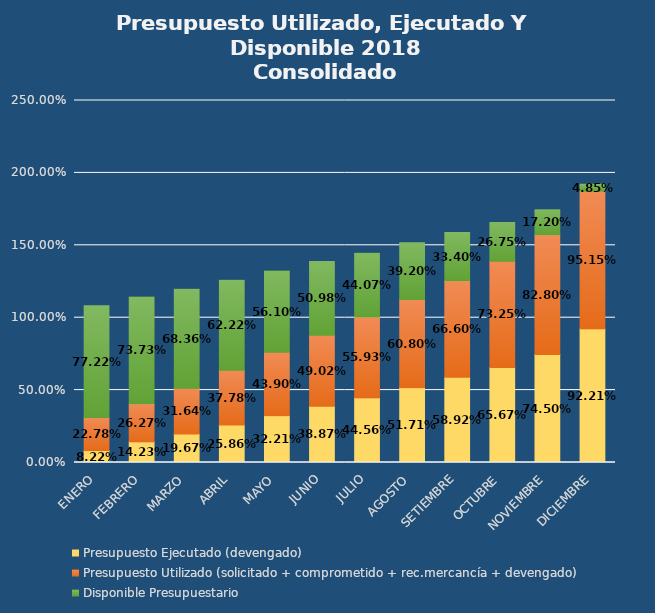
| Category | Presupuesto Ejecutado (devengado) | Presupuesto Utilizado (solicitado + comprometido + rec.mercancía + devengado) | Disponible Presupuestario |
|---|---|---|---|
| ENERO | 0.082 | 0.228 | 0.772 |
| FEBRERO | 0.142 | 0.263 | 0.737 |
| MARZO | 0.197 | 0.316 | 0.684 |
| ABRIL | 0.259 | 0.378 | 0.622 |
| MAYO | 0.322 | 0.439 | 0.561 |
| JUNIO | 0.389 | 0.49 | 0.51 |
| JULIO | 0.446 | 0.559 | 0.441 |
| AGOSTO | 0.517 | 0.608 | 0.392 |
| SETIEMBRE | 0.589 | 0.666 | 0.334 |
| OCTUBRE | 0.657 | 0.732 | 0.268 |
| NOVIEMBRE | 0.745 | 0.828 | 0.172 |
| DICIEMBRE | 0.922 | 0.951 | 0.049 |